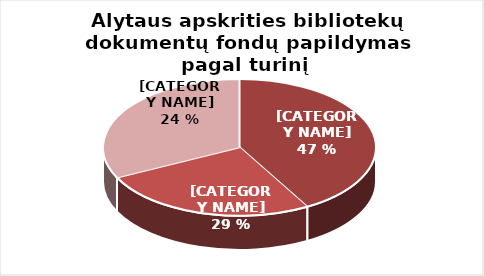
| Category | Series 0 |
|---|---|
| Grožinė literatūra | 18247 |
| Šakinė literatūra | 11360 |
| Periodika | 14106 |